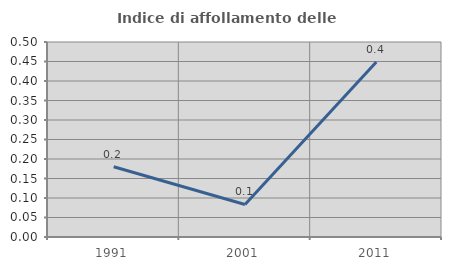
| Category | Indice di affollamento delle abitazioni  |
|---|---|
| 1991.0 | 0.18 |
| 2001.0 | 0.083 |
| 2011.0 | 0.449 |